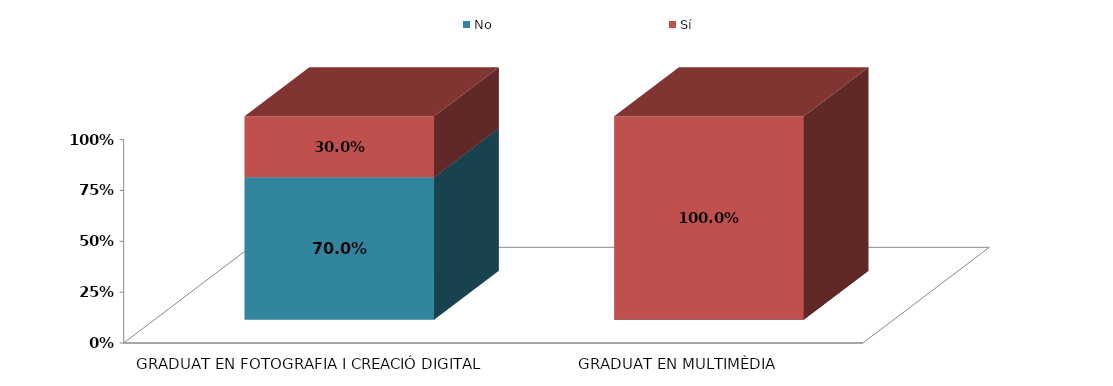
| Category | No | Sí |
|---|---|---|
| GRADUAT EN FOTOGRAFIA I CREACIÓ DIGITAL | 0.7 | 0.3 |
| GRADUAT EN MULTIMÈDIA | 0 | 1 |